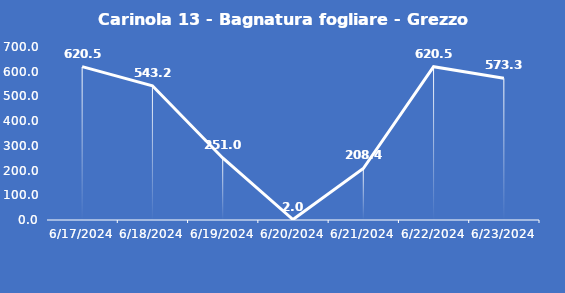
| Category | Carinola 13 - Bagnatura fogliare - Grezzo (min) |
|---|---|
| 6/17/24 | 620.5 |
| 6/18/24 | 543.2 |
| 6/19/24 | 251 |
| 6/20/24 | 2 |
| 6/21/24 | 208.4 |
| 6/22/24 | 620.5 |
| 6/23/24 | 573.3 |